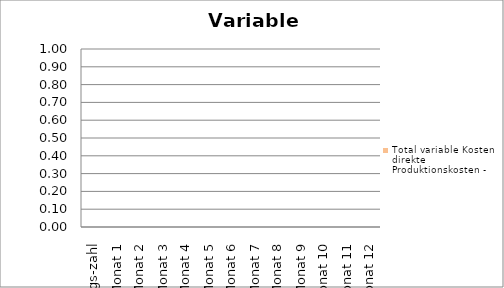
| Category | Total variable Kosten – direkte Produktionskosten |
|---|---|
| Anfangs-zahl | 0 |
| Monat 1 | 0 |
| Monat 2 | 0 |
| Monat 3 | 0 |
| Monat 4 | 0 |
| Monat 5 | 0 |
| Monat 6 | 0 |
| Monat 7 | 0 |
| Monat 8 | 0 |
| Monat 9 | 0 |
| Monat 10 | 0 |
| Monat 11 | 0 |
| Monat 12 | 0 |